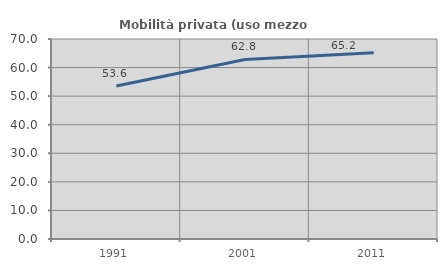
| Category | Mobilità privata (uso mezzo privato) |
|---|---|
| 1991.0 | 53.56 |
| 2001.0 | 62.849 |
| 2011.0 | 65.173 |